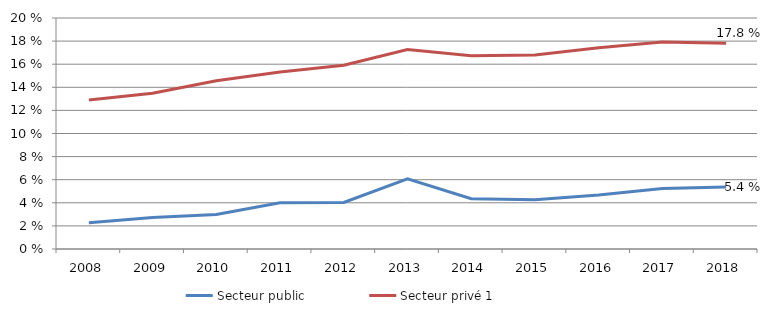
| Category | Secteur public | Secteur privé 1 |
|---|---|---|
| 2008.0 | 0.023 | 0.129 |
| 2009.0 | 0.027 | 0.135 |
| 2010.0 | 0.03 | 0.146 |
| 2011.0 | 0.04 | 0.153 |
| 2012.0 | 0.04 | 0.159 |
| 2013.0 | 0.061 | 0.173 |
| 2014.0 | 0.044 | 0.167 |
| 2015.0 | 0.043 | 0.168 |
| 2016.0 | 0.047 | 0.174 |
| 2017.0 | 0.052 | 0.179 |
| 2018.0 | 0.054 | 0.178 |